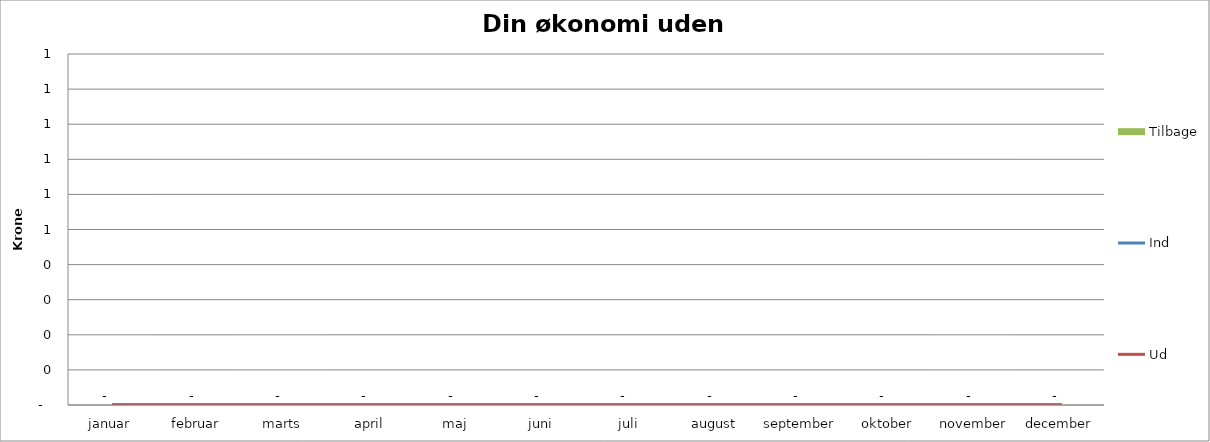
| Category | Tilbage |
|---|---|
| januar | 0 |
| februar | 0 |
| marts | 0 |
| april | 0 |
| maj | 0 |
| juni | 0 |
| juli | 0 |
| august | 0 |
| september | 0 |
| oktober | 0 |
| november | 0 |
| december | 0 |